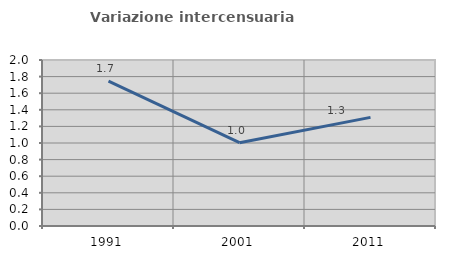
| Category | Variazione intercensuaria annua |
|---|---|
| 1991.0 | 1.746 |
| 2001.0 | 1.004 |
| 2011.0 | 1.309 |